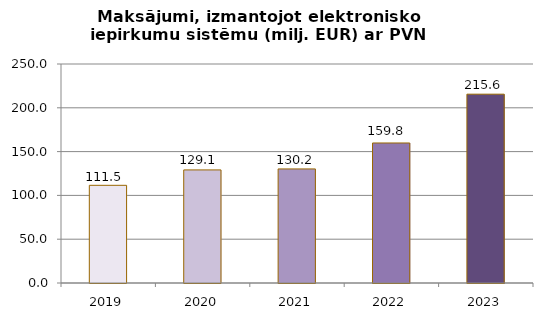
| Category | Maksājumi, izmantojot elektronisko iepirkumu sistēmu (milj. EUR) ar PVN |
|---|---|
| 2019.0 | 111.503 |
| 2020.0 | 129.092 |
| 2021.0 | 130.214 |
| 2022.0 | 159.842 |
| 2023.0 | 215.554 |